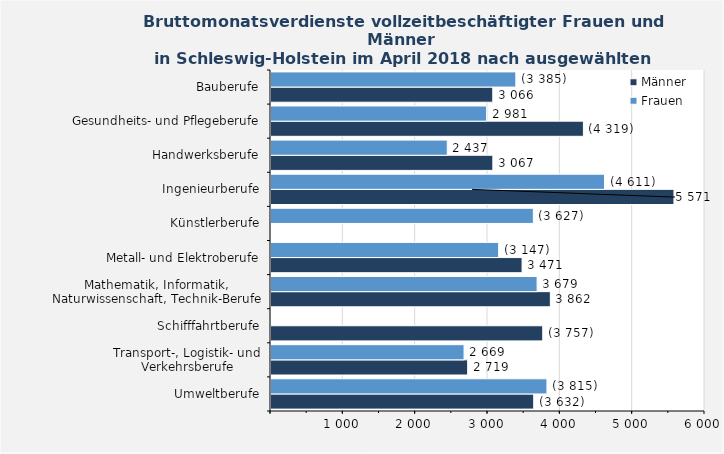
| Category | Männer | Frauen |
|---|---|---|
| Umweltberufe | 3632 | 3815 |
| Transport-, Logistik- und Verkehrsberufe | 2719 | 2669 |
| Schifffahrtberufe | 3757 | 0 |
| Mathematik, Informatik, Naturwissenschaft, Technik-Berufe | 3862 | 3679 |
| Metall- und Elektroberufe | 3471 | 3147 |
| Künstlerberufe | 0 | 3627 |
| Ingenieurberufe | 5571 | 4611 |
| Handwerksberufe | 3067 | 2437 |
| Gesundheits- und Pflegeberufe | 4319 | 2981 |
| Bauberufe | 3066 | 3385 |